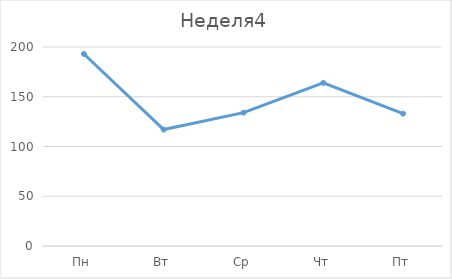
| Category | Неделя4 |
|---|---|
| Пн | 193 |
| Вт | 117 |
| Ср | 134 |
| Чт | 164 |
| Пт | 133 |